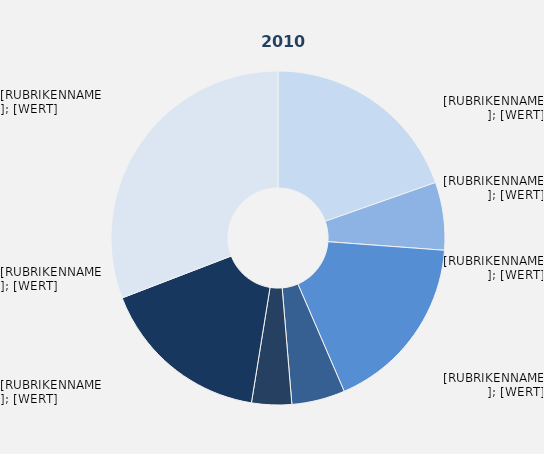
| Category | Series 1 |
|---|---|
| Produzierendes Gewerbe ohne Baugewerbe | 0.196 |
| Baugewerbe | 0.066 |
| Handel | 0.173 |
| Verkehr und Lagerei | 0.052 |
| Gastgewerbe | 0.039 |
| Erbringung von Unternehmens-dienstleistungen | 0.166 |
| Erbringung von öffentlichen und privaten Dienstleistungen | 0.308 |